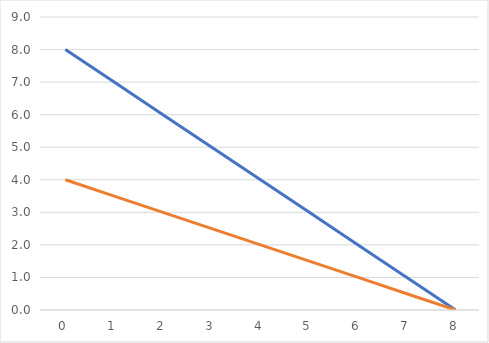
| Category | Iraque | iran |
|---|---|---|
| 0.0 | 8 | 4 |
| 1.0 | 7 | 3.5 |
| 2.0 | 6 | 3 |
| 3.0 | 5 | 2.5 |
| 4.0 | 4 | 2 |
| 5.0 | 3 | 1.5 |
| 6.0 | 2 | 1 |
| 7.0 | 1 | 0.5 |
| 8.0 | 0 | 0 |